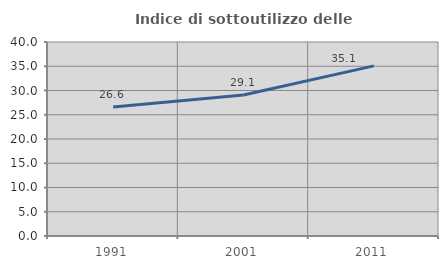
| Category | Indice di sottoutilizzo delle abitazioni  |
|---|---|
| 1991.0 | 26.596 |
| 2001.0 | 29.075 |
| 2011.0 | 35.074 |